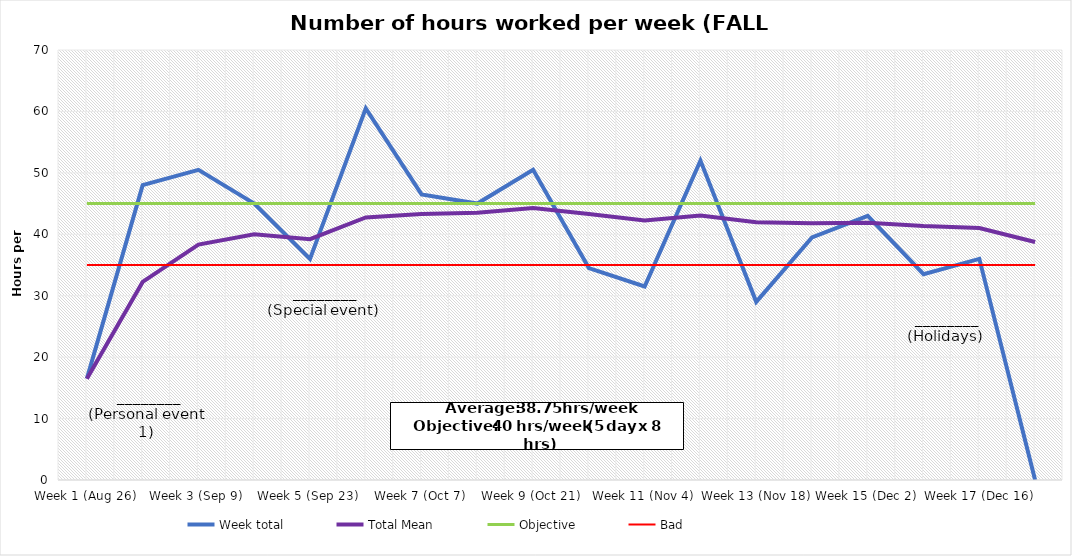
| Category | Week total | Total Mean | Objective | Bad |
|---|---|---|---|---|
| Week 1 (Aug 26) | 16.5 | 16.5 | 45 | 35 |
| Week 2 (Sep 2) | 48 | 32.25 | 45 | 35 |
| Week 3 (Sep 9) | 50.5 | 38.333 | 45 | 35 |
| Week 4 (Sep 16) | 45 | 40 | 45 | 35 |
| Week 5 (Sep 23) | 36 | 39.2 | 45 | 35 |
| Week 6 (Sep 30) | 60.5 | 42.75 | 45 | 35 |
| Week 7 (Oct 7) | 46.5 | 43.286 | 45 | 35 |
| Week 8 (Oct 14) | 45 | 43.5 | 45 | 35 |
| Week 9 (Oct 21) | 50.5 | 44.278 | 45 | 35 |
| Week 10 (Oct 28) | 34.5 | 43.3 | 45 | 35 |
| Week 11 (Nov 4) | 31.5 | 42.227 | 45 | 35 |
| Week 12 (Nov 11) | 52 | 43.042 | 45 | 35 |
| Week 13 (Nov 18) | 29 | 41.962 | 45 | 35 |
| Week 14 (Nov 25) | 39.5 | 41.786 | 45 | 35 |
| Week 15 (Dec 2) | 43 | 41.867 | 45 | 35 |
| Week 16 (Dec 9) | 33.5 | 41.344 | 45 | 35 |
| Week 17 (Dec 16) | 36 | 41.029 | 45 | 35 |
| Week 18 (Dec 23) | 0 | 38.75 | 45 | 35 |